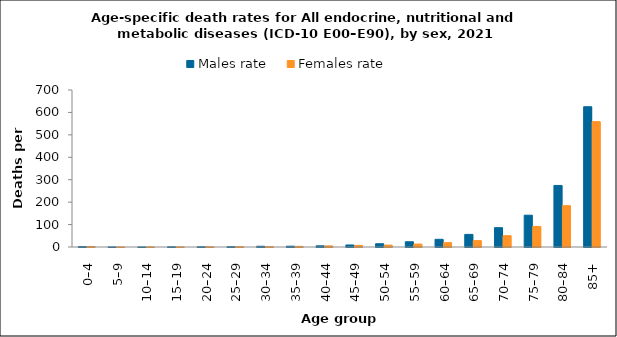
| Category | Males rate | Females rate |
|---|---|---|
| 0–4 | 1.932 | 1.772 |
| 5–9 | 0.241 | 0.127 |
| 10–14 | 0.239 | 0.254 |
| 15–19 | 0.787 | 0.418 |
| 20–24 | 0.956 | 0.763 |
| 25–29 | 1.307 | 1.217 |
| 30–34 | 3.296 | 1.147 |
| 35–39 | 3.555 | 2.662 |
| 40–44 | 5.27 | 4.889 |
| 45–49 | 9.054 | 7.325 |
| 50–54 | 14.607 | 8.564 |
| 55–59 | 23.343 | 13.072 |
| 60–64 | 34.309 | 19.368 |
| 65–69 | 56.191 | 28.373 |
| 70–74 | 86.174 | 50.5 |
| 75–79 | 141.81 | 91.808 |
| 80–84 | 274.442 | 184.128 |
| 85+ | 625.428 | 558.93 |